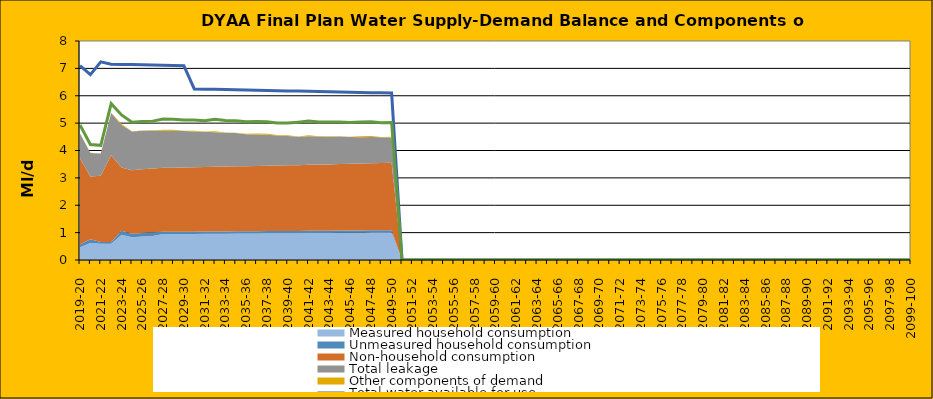
| Category | Total water available for use | Total demand + target headroom (final plan) |
|---|---|---|
| 0 | 7.1 | 4.93 |
| 1 | 6.77 | 4.22 |
| 2 | 7.24 | 4.188 |
| 3 | 7.154 | 5.712 |
| 4 | 7.146 | 5.3 |
| 5 | 7.138 | 5.036 |
| 6 | 7.13 | 5.059 |
| 7 | 7.122 | 5.073 |
| 8 | 7.114 | 5.152 |
| 9 | 7.106 | 5.145 |
| 10 | 7.098 | 5.114 |
| 11 | 6.25 | 5.111 |
| 12 | 6.242 | 5.087 |
| 13 | 6.234 | 5.143 |
| 14 | 6.226 | 5.1 |
| 15 | 6.218 | 5.091 |
| 16 | 6.21 | 5.05 |
| 17 | 6.202 | 5.057 |
| 18 | 6.194 | 5.048 |
| 19 | 6.186 | 5.004 |
| 20 | 6.178 | 5.001 |
| 21 | 6.17 | 5.035 |
| 22 | 6.162 | 5.076 |
| 23 | 6.154 | 5.045 |
| 24 | 6.146 | 5.038 |
| 25 | 6.138 | 5.042 |
| 26 | 6.13 | 5.023 |
| 27 | 6.122 | 5.042 |
| 28 | 6.114 | 5.046 |
| 29 | 6.106 | 5.015 |
| 30 | 6.098 | 5.023 |
| 31 | 0 | 0 |
| 32 | 0 | 0 |
| 33 | 0 | 0 |
| 34 | 0 | 0 |
| 35 | 0 | 0 |
| 36 | 0 | 0 |
| 37 | 0 | 0 |
| 38 | 0 | 0 |
| 39 | 0 | 0 |
| 40 | 0 | 0 |
| 41 | 0 | 0 |
| 42 | 0 | 0 |
| 43 | 0 | 0 |
| 44 | 0 | 0 |
| 45 | 0 | 0 |
| 46 | 0 | 0 |
| 47 | 0 | 0 |
| 48 | 0 | 0 |
| 49 | 0 | 0 |
| 50 | 0 | 0 |
| 51 | 0 | 0 |
| 52 | 0 | 0 |
| 53 | 0 | 0 |
| 54 | 0 | 0 |
| 55 | 0 | 0 |
| 56 | 0 | 0 |
| 57 | 0 | 0 |
| 58 | 0 | 0 |
| 59 | 0 | 0 |
| 60 | 0 | 0 |
| 61 | 0 | 0 |
| 62 | 0 | 0 |
| 63 | 0 | 0 |
| 64 | 0 | 0 |
| 65 | 0 | 0 |
| 66 | 0 | 0 |
| 67 | 0 | 0 |
| 68 | 0 | 0 |
| 69 | 0 | 0 |
| 70 | 0 | 0 |
| 71 | 0 | 0 |
| 72 | 0 | 0 |
| 73 | 0 | 0 |
| 74 | 0 | 0 |
| 75 | 0 | 0 |
| 76 | 0 | 0 |
| 77 | 0 | 0 |
| 78 | 0 | 0 |
| 79 | 0 | 0 |
| 80 | 0 | 0 |